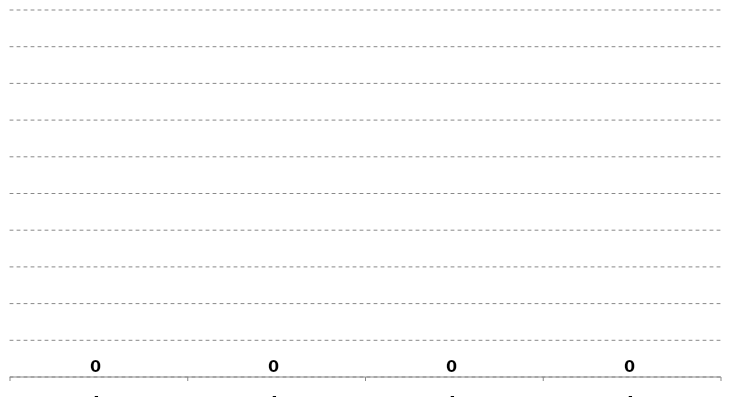
| Category | Series 0 |
|---|---|
| - | 0 |
| - | 0 |
| - | 0 |
| - | 0 |